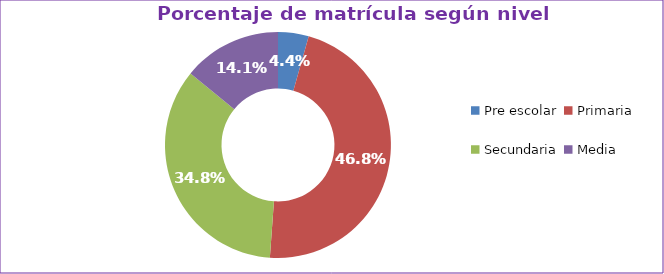
| Category | Series 0 |
|---|---|
| Pre escolar | 0.044 |
| Primaria | 0.468 |
| Secundaria | 0.348 |
| Media | 0.141 |